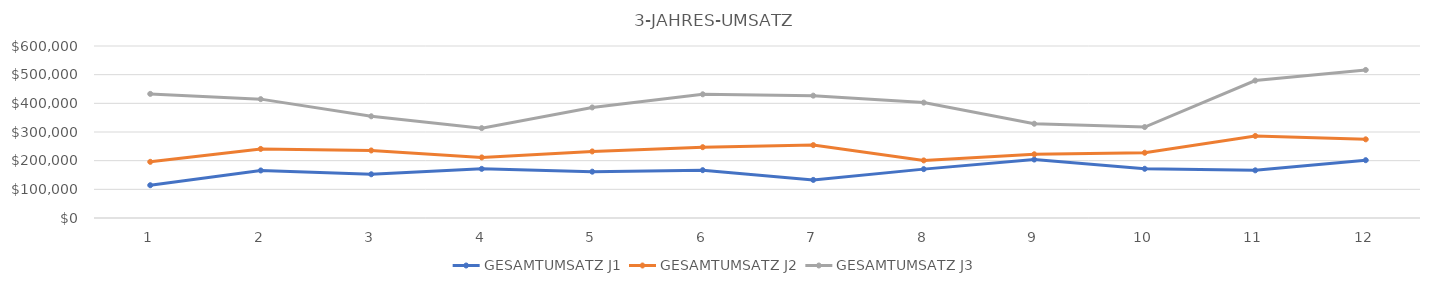
| Category | GESAMTUMSATZ J1 | GESAMTUMSATZ J2 | GESAMTUMSATZ J3 |
|---|---|---|---|
| 0 | 114350 | 195956 | 432976 |
| 1 | 165800 | 240945 | 414652 |
| 2 | 152557 | 235555 | 354787 |
| 3 | 171421 | 211305 | 313504 |
| 4 | 161618 | 232213 | 385676 |
| 5 | 166870 | 247021 | 431520 |
| 6 | 132884 | 254266 | 426803 |
| 7 | 170481 | 200836 | 402533 |
| 8 | 203968 | 222280 | 328813 |
| 9 | 171681 | 227616 | 317269 |
| 10 | 166247 | 286221 | 479413 |
| 11 | 201651 | 274416 | 516463 |